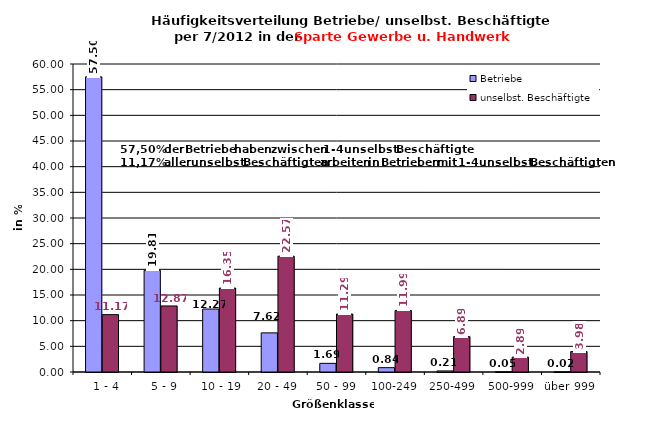
| Category | Betriebe | unselbst. Beschäftigte |
|---|---|---|
|   1 - 4 | 57.496 | 11.174 |
|   5 - 9 | 19.805 | 12.869 |
|  10 - 19 | 12.267 | 16.35 |
| 20 - 49 | 7.623 | 22.565 |
| 50 - 99 | 1.689 | 11.288 |
| 100-249 | 0.844 | 11.99 |
| 250-499 | 0.207 | 6.889 |
| 500-999 | 0.046 | 2.893 |
| über 999 | 0.023 | 3.981 |